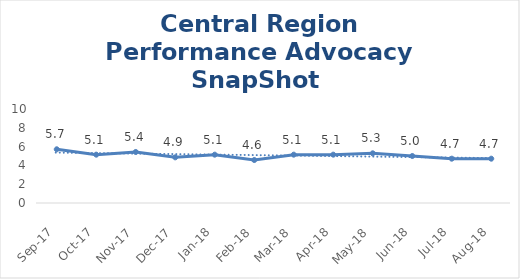
| Category | Central Region |
|---|---|
| Sep-17 | 5.714 |
| Oct-17 | 5.143 |
| Nov-17 | 5.429 |
| Dec-17 | 4.857 |
| Jan-18 | 5.143 |
| Feb-18 | 4.571 |
| Mar-18 | 5.143 |
| Apr-18 | 5.143 |
| May-18 | 5.286 |
| Jun-18 | 5 |
| Jul-18 | 4.714 |
| Aug-18 | 4.714 |